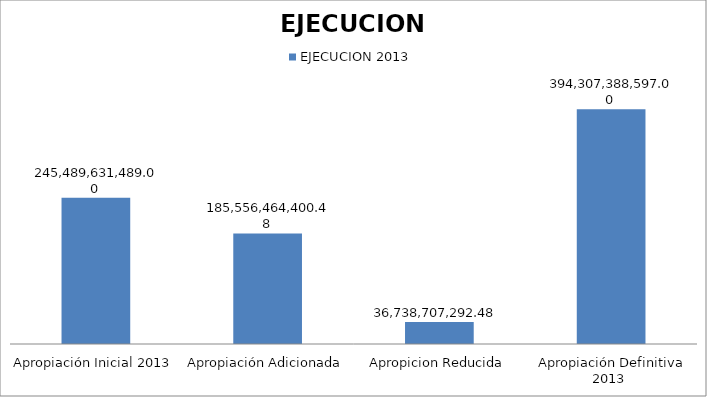
| Category | EJECUCION 2013 |
|---|---|
| Apropiación Inicial 2013 | 245489631489 |
| Apropiación Adicionada | 185556464400.48 |
| Apropicion Reducida | 36738707292.48 |
| Apropiación Definitiva 2013  | 394307388597 |